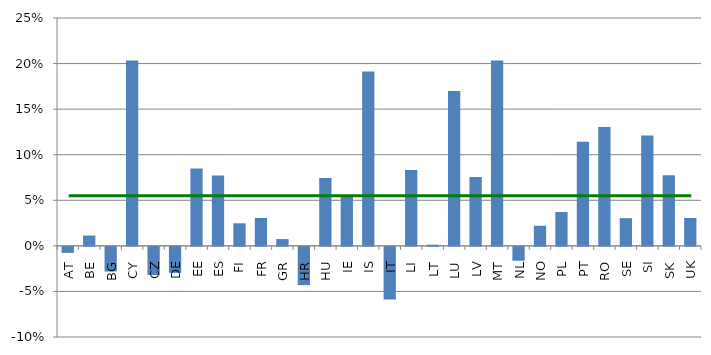
| Category | Analysis Variable : Life_PREM_GROWTH |
|---|---|
| AT | -0.007 |
| BE | 0.011 |
| BG | -0.027 |
| CY | 0.203 |
| CZ | -0.031 |
| DE | -0.029 |
| EE | 0.085 |
| ES | 0.077 |
| FI | 0.025 |
| FR | 0.031 |
| GR | 0.007 |
| HR | -0.042 |
| HU | 0.075 |
| IE | 0.054 |
| IS | 0.191 |
| IT | -0.058 |
| LI | 0.083 |
| LT | 0.001 |
| LU | 0.17 |
| LV | 0.076 |
| MT | 0.203 |
| NL | -0.015 |
| NO | 0.022 |
| PL | 0.037 |
| PT | 0.114 |
| RO | 0.13 |
| SE | 0.03 |
| SI | 0.121 |
| SK | 0.077 |
| UK | 0.031 |